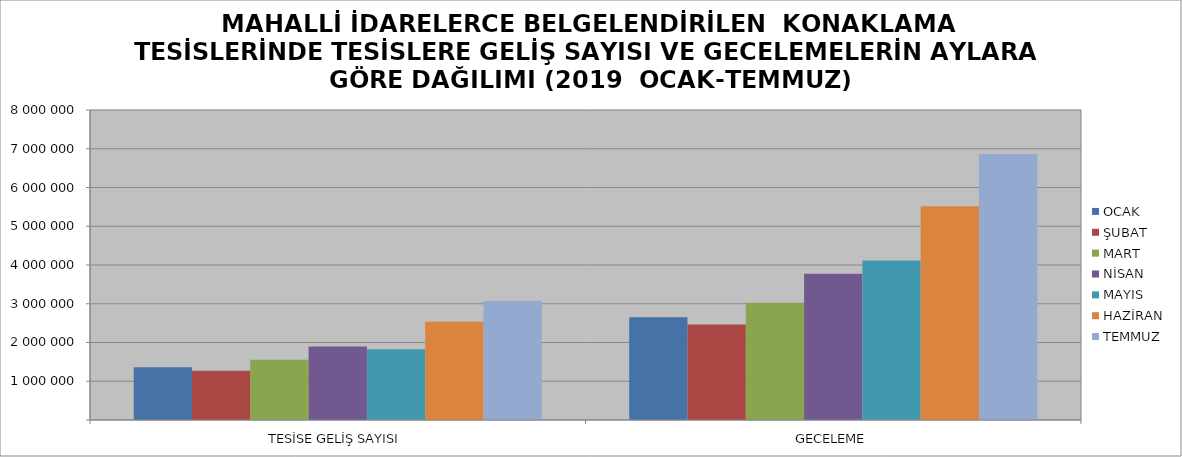
| Category | OCAK | ŞUBAT | MART | NİSAN | MAYIS | HAZİRAN | TEMMUZ |
|---|---|---|---|---|---|---|---|
| TESİSE GELİŞ SAYISI | 1363187 | 1273727 | 1552518 | 1898202 | 1826154 | 2537491 | 3073499 |
| GECELEME | 2649437 | 2462023 | 3024704 | 3772615 | 4117532 | 5513568 | 6866550 |